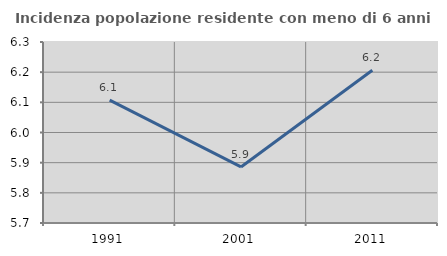
| Category | Incidenza popolazione residente con meno di 6 anni |
|---|---|
| 1991.0 | 6.108 |
| 2001.0 | 5.886 |
| 2011.0 | 6.206 |